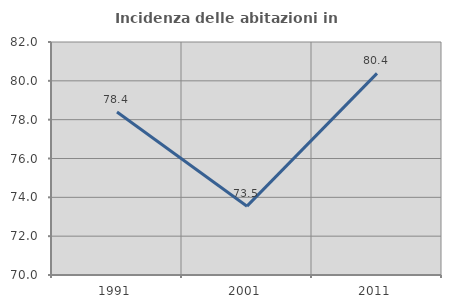
| Category | Incidenza delle abitazioni in proprietà  |
|---|---|
| 1991.0 | 78.395 |
| 2001.0 | 73.545 |
| 2011.0 | 80.383 |